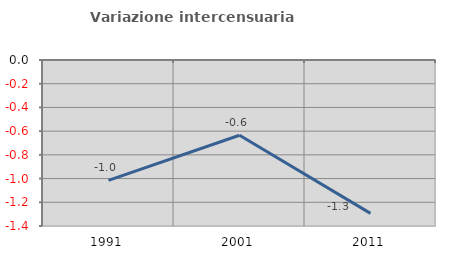
| Category | Variazione intercensuaria annua |
|---|---|
| 1991.0 | -1.016 |
| 2001.0 | -0.635 |
| 2011.0 | -1.293 |